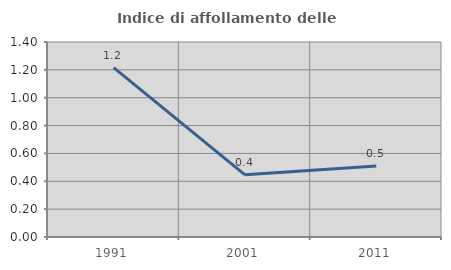
| Category | Indice di affollamento delle abitazioni  |
|---|---|
| 1991.0 | 1.217 |
| 2001.0 | 0.446 |
| 2011.0 | 0.509 |